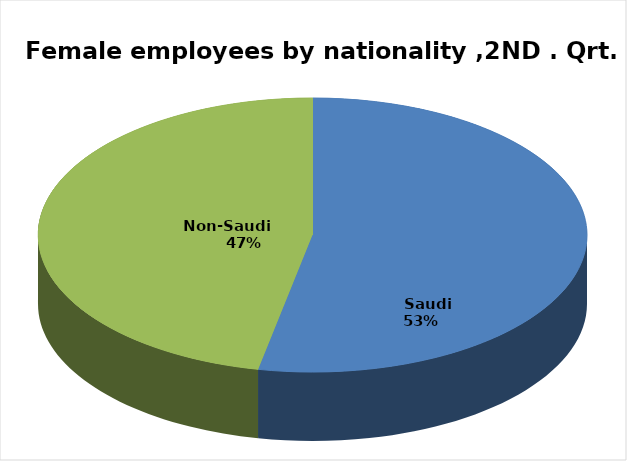
| Category | Series 0 |
|---|---|
|        Saudi      | 160744 |
|          Non-Saudi        | 141590 |